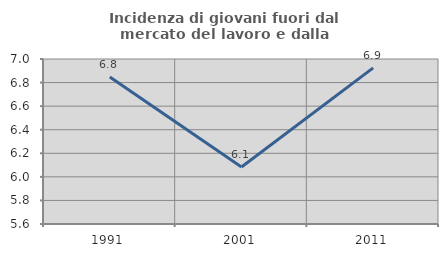
| Category | Incidenza di giovani fuori dal mercato del lavoro e dalla formazione  |
|---|---|
| 1991.0 | 6.847 |
| 2001.0 | 6.083 |
| 2011.0 | 6.925 |